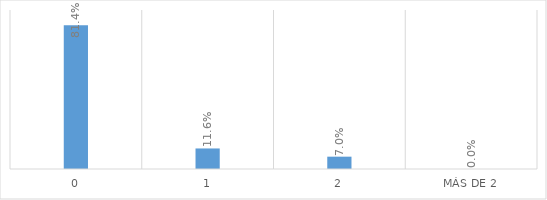
| Category | Series 0 |
|---|---|
| 0 | 0.814 |
| 1 | 0.116 |
| 2 | 0.07 |
| Más de 2 | 0 |